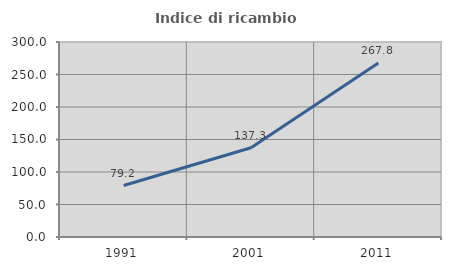
| Category | Indice di ricambio occupazionale  |
|---|---|
| 1991.0 | 79.173 |
| 2001.0 | 137.339 |
| 2011.0 | 267.77 |